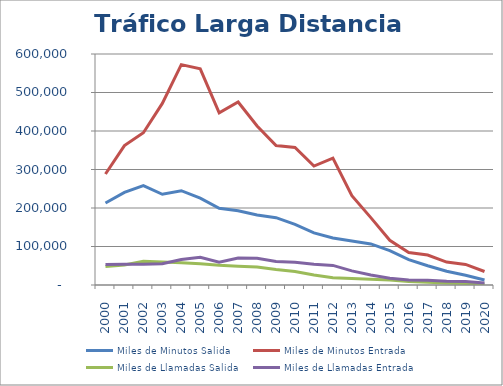
| Category | Miles de Minutos Salida  | Miles de Minutos Entrada | Miles de Llamadas Salida  | Miles de Llamadas Entrada |
|---|---|---|---|---|
| 2000 | 213111.889 | 288388.125 | 47935.313 | 52952.484 |
| 2001 | 240624.31 | 362105.965 | 51890.32 | 54050.474 |
| 2002 | 258263.207 | 395584.068 | 61696.706 | 53755.419 |
| 2003 | 235632.811 | 471710.26 | 59645.256 | 55151.805 |
| 2004 | 244879.421 | 572384.671 | 57875.109 | 66165.546 |
| 2005 | 225481.003 | 561441.7 | 55265.499 | 71975.899 |
| 2006 | 199057.012 | 447154.99 | 51113.174 | 58982.629 |
| 2007 | 193031.5 | 475329.384 | 48858.076 | 69933.935 |
| 2008 | 181903.703 | 413059.388 | 46744.176 | 69543.737 |
| 2009 | 174879.763 | 362075.623 | 40361.941 | 61194.621 |
| 2010 | 157654.648 | 357007.697 | 35316.058 | 59359.736 |
| 2011 | 135339.983 | 308905.292 | 26149.205 | 53691.514 |
| 2012 | 122043.466 | 329431.656 | 19101.011 | 50924.858 |
| 2013 | 114017.404 | 231797.265 | 17114.809 | 36575.406 |
| 2014 | 106668.68 | 175029.52 | 14990.781 | 25922.441 |
| 2015 | 89068.424 | 116143.021 | 12805.823 | 17673.903 |
| 2016 | 65918.92 | 84198.464 | 9191.072 | 13242.616 |
| 2017 | 49870.641 | 77843.799 | 7080.087 | 12633.004 |
| 2018 | 35557.963 | 59535.298 | 5474.876 | 9441.969 |
| 2019 | 25349.667 | 53475.314 | 4208.392 | 9021.467 |
| 2020 | 12941.994 | 35070.672 | 2247.183 | 5303.683 |